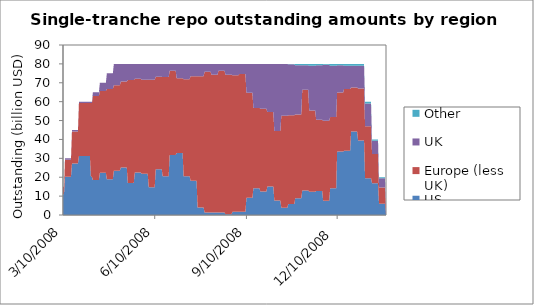
| Category | US | Europe (less UK) | UK | Other |
|---|---|---|---|---|
| 3/10/08 | 11 | 4 | 0 | 0 |
| 3/11/08 | 11 | 4 | 0 | 0 |
| 3/12/08 | 20.238 | 9 | 0.762 | 0 |
| 3/13/08 | 20.238 | 9 | 0.762 | 0 |
| 3/14/08 | 20.238 | 9 | 0.762 | 0 |
| 3/15/08 | 20.238 | 9 | 0.762 | 0 |
| 3/16/08 | 20.238 | 9 | 0.762 | 0 |
| 3/17/08 | 20.238 | 9 | 0.762 | 0 |
| 3/18/08 | 20.238 | 9 | 0.762 | 0 |
| 3/19/08 | 27.238 | 17 | 0.762 | 0 |
| 3/20/08 | 27.238 | 17 | 0.762 | 0 |
| 3/21/08 | 27.238 | 17 | 0.762 | 0 |
| 3/22/08 | 27.238 | 17 | 0.762 | 0 |
| 3/23/08 | 27.238 | 17 | 0.762 | 0 |
| 3/24/08 | 27.238 | 17 | 0.762 | 0 |
| 3/25/08 | 27.238 | 17 | 0.762 | 0 |
| 3/26/08 | 31.238 | 28 | 0.762 | 0 |
| 3/27/08 | 31.238 | 28 | 0.762 | 0 |
| 3/28/08 | 31.238 | 28 | 0.762 | 0 |
| 3/29/08 | 31.238 | 28 | 0.762 | 0 |
| 3/30/08 | 31.238 | 28 | 0.762 | 0 |
| 3/31/08 | 31.238 | 28 | 0.762 | 0 |
| 4/1/08 | 31.238 | 28 | 0.762 | 0 |
| 4/2/08 | 31.238 | 28 | 0.762 | 0 |
| 4/3/08 | 31.238 | 28 | 0.762 | 0 |
| 4/4/08 | 31.238 | 28 | 0.762 | 0 |
| 4/5/08 | 31.238 | 28 | 0.762 | 0 |
| 4/6/08 | 31.238 | 28 | 0.762 | 0 |
| 4/7/08 | 20.238 | 39 | 0.762 | 0 |
| 4/8/08 | 20.238 | 39 | 0.762 | 0 |
| 4/9/08 | 18.5 | 44.5 | 2 | 0 |
| 4/10/08 | 18.5 | 44.5 | 2 | 0 |
| 4/11/08 | 18.5 | 44.5 | 2 | 0 |
| 4/12/08 | 18.5 | 44.5 | 2 | 0 |
| 4/13/08 | 18.5 | 44.5 | 2 | 0 |
| 4/14/08 | 18.5 | 44.5 | 2 | 0 |
| 4/15/08 | 18.5 | 44.5 | 2 | 0 |
| 4/16/08 | 22.32 | 43.34 | 4.34 | 0 |
| 4/17/08 | 22.32 | 43.34 | 4.34 | 0 |
| 4/18/08 | 22.32 | 43.34 | 4.34 | 0 |
| 4/19/08 | 22.32 | 43.34 | 4.34 | 0 |
| 4/20/08 | 22.32 | 43.34 | 4.34 | 0 |
| 4/21/08 | 22.32 | 43.34 | 4.34 | 0 |
| 4/22/08 | 22.32 | 43.34 | 4.34 | 0 |
| 4/23/08 | 18.957 | 47.703 | 8.34 | 0 |
| 4/24/08 | 18.957 | 47.703 | 8.34 | 0 |
| 4/25/08 | 18.957 | 47.703 | 8.34 | 0 |
| 4/26/08 | 18.957 | 47.703 | 8.34 | 0 |
| 4/27/08 | 18.957 | 47.703 | 8.34 | 0 |
| 4/28/08 | 18.957 | 47.703 | 8.34 | 0 |
| 4/29/08 | 18.957 | 47.703 | 8.34 | 0 |
| 4/30/08 | 23.457 | 45.203 | 11.34 | 0 |
| 5/1/08 | 23.457 | 45.203 | 11.34 | 0 |
| 5/2/08 | 23.457 | 45.203 | 11.34 | 0 |
| 5/3/08 | 23.457 | 45.203 | 11.34 | 0 |
| 5/4/08 | 23.457 | 45.203 | 11.34 | 0 |
| 5/5/08 | 23.457 | 45.203 | 11.34 | 0 |
| 5/6/08 | 23.457 | 45.203 | 11.34 | 0 |
| 5/7/08 | 25.082 | 45.578 | 9.34 | 0 |
| 5/8/08 | 25.082 | 45.578 | 9.34 | 0 |
| 5/9/08 | 25.082 | 45.578 | 9.34 | 0 |
| 5/10/08 | 25.082 | 45.578 | 9.34 | 0 |
| 5/11/08 | 25.082 | 45.578 | 9.34 | 0 |
| 5/12/08 | 25.082 | 45.578 | 9.34 | 0 |
| 5/13/08 | 25.082 | 45.578 | 9.34 | 0 |
| 5/14/08 | 16.949 | 54.489 | 8.562 | 0 |
| 5/15/08 | 16.949 | 54.489 | 8.562 | 0 |
| 5/16/08 | 16.949 | 54.489 | 8.562 | 0 |
| 5/17/08 | 16.949 | 54.489 | 8.562 | 0 |
| 5/18/08 | 16.949 | 54.489 | 8.562 | 0 |
| 5/19/08 | 16.949 | 54.489 | 8.562 | 0 |
| 5/20/08 | 16.949 | 54.489 | 8.562 | 0 |
| 5/21/08 | 22.463 | 49.616 | 7.921 | 0 |
| 5/22/08 | 22.463 | 49.616 | 7.921 | 0 |
| 5/23/08 | 22.463 | 49.616 | 7.921 | 0 |
| 5/24/08 | 22.463 | 49.616 | 7.921 | 0 |
| 5/25/08 | 22.463 | 49.616 | 7.921 | 0 |
| 5/26/08 | 22.463 | 49.616 | 7.921 | 0 |
| 5/27/08 | 22.463 | 49.616 | 7.921 | 0 |
| 5/28/08 | 21.82 | 49.831 | 8.349 | 0 |
| 5/29/08 | 21.82 | 49.831 | 8.349 | 0 |
| 5/30/08 | 21.82 | 49.831 | 8.349 | 0 |
| 5/31/08 | 21.82 | 49.831 | 8.349 | 0 |
| 6/1/08 | 21.82 | 49.831 | 8.349 | 0 |
| 6/2/08 | 21.82 | 49.831 | 8.349 | 0 |
| 6/3/08 | 21.82 | 49.831 | 8.349 | 0 |
| 6/4/08 | 14.695 | 56.956 | 8.349 | 0 |
| 6/5/08 | 14.695 | 56.956 | 8.349 | 0 |
| 6/6/08 | 14.695 | 56.956 | 8.349 | 0 |
| 6/7/08 | 14.695 | 56.956 | 8.349 | 0 |
| 6/8/08 | 14.695 | 56.956 | 8.349 | 0 |
| 6/9/08 | 14.695 | 56.956 | 8.349 | 0 |
| 6/10/08 | 14.695 | 56.956 | 8.349 | 0 |
| 6/11/08 | 24.272 | 48.941 | 6.787 | 0 |
| 6/12/08 | 24.272 | 48.941 | 6.787 | 0 |
| 6/13/08 | 24.272 | 48.941 | 6.787 | 0 |
| 6/14/08 | 24.272 | 48.941 | 6.787 | 0 |
| 6/15/08 | 24.272 | 48.941 | 6.787 | 0 |
| 6/16/08 | 24.272 | 48.941 | 6.787 | 0 |
| 6/17/08 | 24.272 | 48.941 | 6.787 | 0 |
| 6/18/08 | 20.478 | 52.522 | 7 | 0 |
| 6/19/08 | 20.478 | 52.522 | 7 | 0 |
| 6/20/08 | 20.478 | 52.522 | 7 | 0 |
| 6/21/08 | 20.478 | 52.522 | 7 | 0 |
| 6/22/08 | 20.478 | 52.522 | 7 | 0 |
| 6/23/08 | 20.478 | 52.522 | 7 | 0 |
| 6/24/08 | 20.478 | 52.522 | 7 | 0 |
| 6/25/08 | 31.821 | 44.607 | 3.572 | 0 |
| 6/26/08 | 31.821 | 44.607 | 3.572 | 0 |
| 6/27/08 | 31.821 | 44.607 | 3.572 | 0 |
| 6/28/08 | 31.821 | 44.607 | 3.572 | 0 |
| 6/29/08 | 31.821 | 44.607 | 3.572 | 0 |
| 6/30/08 | 31.821 | 44.607 | 3.572 | 0 |
| 7/1/08 | 31.821 | 44.607 | 3.572 | 0 |
| 7/2/08 | 32.771 | 39.657 | 7.572 | 0 |
| 7/3/08 | 32.771 | 39.657 | 7.572 | 0 |
| 7/4/08 | 32.771 | 39.657 | 7.572 | 0 |
| 7/5/08 | 32.771 | 39.657 | 7.572 | 0 |
| 7/6/08 | 32.771 | 39.657 | 7.572 | 0 |
| 7/7/08 | 32.771 | 39.657 | 7.572 | 0 |
| 7/8/08 | 32.771 | 39.657 | 7.572 | 0 |
| 7/9/08 | 20.507 | 51.421 | 8.072 | 0 |
| 7/10/08 | 20.507 | 51.421 | 8.072 | 0 |
| 7/11/08 | 20.507 | 51.421 | 8.072 | 0 |
| 7/12/08 | 20.507 | 51.421 | 8.072 | 0 |
| 7/13/08 | 20.507 | 51.421 | 8.072 | 0 |
| 7/14/08 | 20.507 | 51.421 | 8.072 | 0 |
| 7/15/08 | 20.507 | 51.421 | 8.072 | 0 |
| 7/16/08 | 18.15 | 55.35 | 6.5 | 0 |
| 7/17/08 | 18.15 | 55.35 | 6.5 | 0 |
| 7/18/08 | 18.15 | 55.35 | 6.5 | 0 |
| 7/19/08 | 18.15 | 55.35 | 6.5 | 0 |
| 7/20/08 | 18.15 | 55.35 | 6.5 | 0 |
| 7/21/08 | 18.15 | 55.35 | 6.5 | 0 |
| 7/22/08 | 18.15 | 55.35 | 6.5 | 0 |
| 7/23/08 | 3.95 | 69.55 | 6.5 | 0 |
| 7/24/08 | 3.95 | 69.55 | 6.5 | 0 |
| 7/25/08 | 3.95 | 69.55 | 6.5 | 0 |
| 7/26/08 | 3.95 | 69.55 | 6.5 | 0 |
| 7/27/08 | 3.95 | 69.55 | 6.5 | 0 |
| 7/28/08 | 3.95 | 69.55 | 6.5 | 0 |
| 7/29/08 | 3.95 | 69.55 | 6.5 | 0 |
| 7/30/08 | 1.35 | 74.466 | 4.184 | 0 |
| 7/31/08 | 1.35 | 74.466 | 4.184 | 0 |
| 8/1/08 | 1.35 | 74.466 | 4.184 | 0 |
| 8/2/08 | 1.35 | 74.466 | 4.184 | 0 |
| 8/3/08 | 1.35 | 74.466 | 4.184 | 0 |
| 8/4/08 | 1.35 | 74.466 | 4.184 | 0 |
| 8/5/08 | 1.35 | 74.466 | 4.184 | 0 |
| 8/6/08 | 1.35 | 72.966 | 5.684 | 0 |
| 8/7/08 | 1.35 | 72.966 | 5.684 | 0 |
| 8/8/08 | 1.35 | 72.966 | 5.684 | 0 |
| 8/9/08 | 1.35 | 72.966 | 5.684 | 0 |
| 8/10/08 | 1.35 | 72.966 | 5.684 | 0 |
| 8/11/08 | 1.35 | 72.966 | 5.684 | 0 |
| 8/12/08 | 1.35 | 72.966 | 5.684 | 0 |
| 8/13/08 | 1.35 | 74.966 | 3.684 | 0 |
| 8/14/08 | 1.35 | 74.966 | 3.684 | 0 |
| 8/15/08 | 1.35 | 74.966 | 3.684 | 0 |
| 8/16/08 | 1.35 | 74.966 | 3.684 | 0 |
| 8/17/08 | 1.35 | 74.966 | 3.684 | 0 |
| 8/18/08 | 1.35 | 74.966 | 3.684 | 0 |
| 8/19/08 | 1.35 | 74.966 | 3.684 | 0 |
| 8/20/08 | 0.35 | 73.966 | 5.684 | 0 |
| 8/21/08 | 0.35 | 73.966 | 5.684 | 0 |
| 8/22/08 | 0.35 | 73.966 | 5.684 | 0 |
| 8/23/08 | 0.35 | 73.966 | 5.684 | 0 |
| 8/24/08 | 0.35 | 73.966 | 5.684 | 0 |
| 8/25/08 | 0.35 | 73.966 | 5.684 | 0 |
| 8/26/08 | 0.35 | 73.966 | 5.684 | 0 |
| 8/27/08 | 1.657 | 72.343 | 6 | 0 |
| 8/28/08 | 1.657 | 72.343 | 6 | 0 |
| 8/29/08 | 1.657 | 72.343 | 6 | 0 |
| 8/30/08 | 1.657 | 72.343 | 6 | 0 |
| 8/31/08 | 1.657 | 72.343 | 6 | 0 |
| 9/1/08 | 1.657 | 72.343 | 6 | 0 |
| 9/2/08 | 1.657 | 72.343 | 6 | 0 |
| 9/3/08 | 1.728 | 72.985 | 5.287 | 0 |
| 9/4/08 | 1.728 | 72.985 | 5.287 | 0 |
| 9/5/08 | 1.728 | 72.985 | 5.287 | 0 |
| 9/6/08 | 1.728 | 72.985 | 5.287 | 0 |
| 9/7/08 | 1.728 | 72.985 | 5.287 | 0 |
| 9/8/08 | 1.728 | 72.985 | 5.287 | 0 |
| 9/9/08 | 1.728 | 72.985 | 5.287 | 0 |
| 9/10/08 | 9.111 | 55.602 | 15.287 | 0 |
| 9/11/08 | 9.111 | 55.602 | 15.287 | 0 |
| 9/12/08 | 9.111 | 55.602 | 15.287 | 0 |
| 9/13/08 | 9.111 | 55.602 | 15.287 | 0 |
| 9/14/08 | 9.111 | 55.602 | 15.287 | 0 |
| 9/15/08 | 9.111 | 55.602 | 15.287 | 0 |
| 9/16/08 | 9.111 | 55.602 | 15.287 | 0 |
| 9/17/08 | 14.111 | 42.602 | 23.287 | 0 |
| 9/18/08 | 14.111 | 42.602 | 23.287 | 0 |
| 9/19/08 | 14.111 | 42.602 | 23.287 | 0 |
| 9/20/08 | 14.111 | 42.602 | 23.287 | 0 |
| 9/21/08 | 14.111 | 42.602 | 23.287 | 0 |
| 9/22/08 | 14.111 | 42.602 | 23.287 | 0 |
| 9/23/08 | 14.111 | 42.602 | 23.287 | 0 |
| 9/24/08 | 12.454 | 43.759 | 23.787 | 0 |
| 9/25/08 | 12.454 | 43.759 | 23.787 | 0 |
| 9/26/08 | 12.454 | 43.759 | 23.787 | 0 |
| 9/27/08 | 12.454 | 43.759 | 23.787 | 0 |
| 9/28/08 | 12.454 | 43.759 | 23.787 | 0 |
| 9/29/08 | 12.454 | 43.759 | 23.787 | 0 |
| 9/30/08 | 12.454 | 43.759 | 23.787 | 0 |
| 10/1/08 | 15.049 | 39.451 | 25.5 | 0 |
| 10/2/08 | 15.049 | 39.451 | 25.5 | 0 |
| 10/3/08 | 15.049 | 39.451 | 25.5 | 0 |
| 10/4/08 | 15.049 | 39.451 | 25.5 | 0 |
| 10/5/08 | 15.049 | 39.451 | 25.5 | 0 |
| 10/6/08 | 15.049 | 39.451 | 25.5 | 0 |
| 10/7/08 | 15.049 | 39.451 | 25.5 | 0 |
| 10/8/08 | 7.666 | 36.834 | 35.5 | 0 |
| 10/9/08 | 7.666 | 36.834 | 35.5 | 0 |
| 10/10/08 | 7.666 | 36.834 | 35.5 | 0 |
| 10/11/08 | 7.666 | 36.834 | 35.5 | 0 |
| 10/12/08 | 7.666 | 36.834 | 35.5 | 0 |
| 10/13/08 | 7.666 | 36.834 | 35.5 | 0 |
| 10/14/08 | 7.666 | 36.834 | 35.5 | 0 |
| 10/15/08 | 3.874 | 48.626 | 27.5 | 0 |
| 10/16/08 | 3.874 | 48.626 | 27.5 | 0 |
| 10/17/08 | 3.874 | 48.626 | 27.5 | 0 |
| 10/18/08 | 3.874 | 48.626 | 27.5 | 0 |
| 10/19/08 | 3.874 | 48.626 | 27.5 | 0 |
| 10/20/08 | 3.874 | 48.626 | 27.5 | 0 |
| 10/21/08 | 3.874 | 48.626 | 27.5 | 0 |
| 10/22/08 | 5.805 | 46.954 | 27 | 0.241 |
| 10/23/08 | 5.805 | 46.954 | 27 | 0.241 |
| 10/24/08 | 5.805 | 46.954 | 27 | 0.241 |
| 10/25/08 | 5.805 | 46.954 | 27 | 0.241 |
| 10/26/08 | 5.805 | 46.954 | 27 | 0.241 |
| 10/27/08 | 5.805 | 46.954 | 27 | 0.241 |
| 10/28/08 | 5.805 | 46.954 | 27 | 0.241 |
| 10/29/08 | 8.889 | 44.37 | 26 | 0.741 |
| 10/30/08 | 8.889 | 44.37 | 26 | 0.741 |
| 10/31/08 | 8.889 | 44.37 | 26 | 0.741 |
| 11/1/08 | 8.889 | 44.37 | 26 | 0.741 |
| 11/2/08 | 8.889 | 44.37 | 26 | 0.741 |
| 11/3/08 | 8.889 | 44.37 | 26 | 0.741 |
| 11/4/08 | 8.889 | 44.37 | 26 | 0.741 |
| 11/5/08 | 13.031 | 53.228 | 13 | 0.741 |
| 11/6/08 | 13.031 | 53.228 | 13 | 0.741 |
| 11/7/08 | 13.031 | 53.228 | 13 | 0.741 |
| 11/8/08 | 13.031 | 53.228 | 13 | 0.741 |
| 11/9/08 | 13.031 | 53.228 | 13 | 0.741 |
| 11/10/08 | 13.031 | 53.228 | 13 | 0.741 |
| 11/11/08 | 13.031 | 53.228 | 13 | 0.741 |
| 11/12/08 | 12.323 | 42.936 | 23.75 | 0.991 |
| 11/13/08 | 12.323 | 42.936 | 23.75 | 0.991 |
| 11/14/08 | 12.323 | 42.936 | 23.75 | 0.991 |
| 11/15/08 | 12.323 | 42.936 | 23.75 | 0.991 |
| 11/16/08 | 12.323 | 42.936 | 23.75 | 0.991 |
| 11/17/08 | 12.323 | 42.936 | 23.75 | 0.991 |
| 11/18/08 | 12.323 | 42.936 | 23.75 | 0.991 |
| 11/19/08 | 12.757 | 37.608 | 28.885 | 0.75 |
| 11/20/08 | 12.757 | 37.608 | 28.885 | 0.75 |
| 11/21/08 | 12.757 | 37.608 | 28.885 | 0.75 |
| 11/22/08 | 12.757 | 37.608 | 28.885 | 0.75 |
| 11/23/08 | 12.757 | 37.608 | 28.885 | 0.75 |
| 11/24/08 | 12.757 | 37.608 | 28.885 | 0.75 |
| 11/25/08 | 12.757 | 37.608 | 28.885 | 0.75 |
| 11/26/08 | 7.507 | 42.358 | 29.655 | 0.48 |
| 11/27/08 | 7.507 | 42.358 | 29.655 | 0.48 |
| 11/28/08 | 7.507 | 42.358 | 29.655 | 0.48 |
| 11/29/08 | 7.507 | 42.358 | 29.655 | 0.48 |
| 11/30/08 | 7.507 | 42.358 | 29.655 | 0.48 |
| 12/1/08 | 7.507 | 42.358 | 29.655 | 0.48 |
| 12/2/08 | 7.507 | 42.358 | 29.655 | 0.48 |
| 12/3/08 | 14.115 | 37.75 | 27.155 | 0.98 |
| 12/4/08 | 14.115 | 37.75 | 27.155 | 0.98 |
| 12/5/08 | 14.115 | 37.75 | 27.155 | 0.98 |
| 12/6/08 | 14.115 | 37.75 | 27.155 | 0.98 |
| 12/7/08 | 14.115 | 37.75 | 27.155 | 0.98 |
| 12/8/08 | 14.115 | 37.75 | 27.155 | 0.98 |
| 12/9/08 | 14.115 | 37.75 | 27.155 | 0.98 |
| 12/10/08 | 33.615 | 31.25 | 14.405 | 0.73 |
| 12/11/08 | 33.615 | 31.25 | 14.405 | 0.73 |
| 12/12/08 | 33.615 | 31.25 | 14.405 | 0.73 |
| 12/13/08 | 33.615 | 31.25 | 14.405 | 0.73 |
| 12/14/08 | 33.615 | 31.25 | 14.405 | 0.73 |
| 12/15/08 | 33.615 | 31.25 | 14.405 | 0.73 |
| 12/16/08 | 33.615 | 31.25 | 14.405 | 0.73 |
| 12/17/08 | 34 | 32.75 | 12.27 | 0.98 |
| 12/18/08 | 34 | 32.75 | 12.27 | 0.98 |
| 12/19/08 | 34 | 32.75 | 12.27 | 0.98 |
| 12/20/08 | 34 | 32.75 | 12.27 | 0.98 |
| 12/21/08 | 34 | 32.75 | 12.27 | 0.98 |
| 12/22/08 | 34 | 32.75 | 12.27 | 0.98 |
| 12/23/08 | 34 | 32.75 | 12.27 | 0.98 |
| 12/24/08 | 44.25 | 23.25 | 11.5 | 1 |
| 12/25/08 | 44.25 | 23.25 | 11.5 | 1 |
| 12/26/08 | 44.25 | 23.25 | 11.5 | 1 |
| 12/27/08 | 44.25 | 23.25 | 11.5 | 1 |
| 12/28/08 | 44.25 | 23.25 | 11.5 | 1 |
| 12/29/08 | 44.25 | 23.25 | 11.5 | 1 |
| 12/30/08 | 44.25 | 23.25 | 11.5 | 1 |
| 12/31/08 | 39.5 | 27.5 | 12 | 1 |
| 1/1/09 | 39.5 | 27.5 | 12 | 1 |
| 1/2/09 | 39.5 | 27.5 | 12 | 1 |
| 1/3/09 | 39.5 | 27.5 | 12 | 1 |
| 1/4/09 | 39.5 | 27.5 | 12 | 1 |
| 1/5/09 | 39.5 | 27.5 | 12 | 1 |
| 1/6/09 | 39.5 | 27.5 | 12 | 1 |
| 1/7/09 | 19.5 | 27.5 | 12 | 1 |
| 1/8/09 | 19.5 | 27.5 | 12 | 1 |
| 1/9/09 | 19.5 | 27.5 | 12 | 1 |
| 1/10/09 | 19.5 | 27.5 | 12 | 1 |
| 1/11/09 | 19.5 | 27.5 | 12 | 1 |
| 1/12/09 | 19.5 | 27.5 | 12 | 1 |
| 1/13/09 | 19.5 | 27.5 | 12 | 1 |
| 1/14/09 | 16.75 | 15.5 | 7 | 0.75 |
| 1/15/09 | 16.75 | 15.5 | 7 | 0.75 |
| 1/16/09 | 16.75 | 15.5 | 7 | 0.75 |
| 1/17/09 | 16.75 | 15.5 | 7 | 0.75 |
| 1/18/09 | 16.75 | 15.5 | 7 | 0.75 |
| 1/19/09 | 16.75 | 15.5 | 7 | 0.75 |
| 1/20/09 | 16.75 | 15.5 | 7 | 0.75 |
| 1/21/09 | 6 | 8.5 | 5 | 0.5 |
| 1/22/09 | 6 | 8.5 | 5 | 0.5 |
| 1/23/09 | 6 | 8.5 | 5 | 0.5 |
| 1/24/09 | 6 | 8.5 | 5 | 0.5 |
| 1/25/09 | 6 | 8.5 | 5 | 0.5 |
| 1/26/09 | 6 | 8.5 | 5 | 0.5 |
| 1/27/09 | 6 | 8.5 | 5 | 0.5 |
| 1/28/09 | 0 | 0 | 0 | 0 |